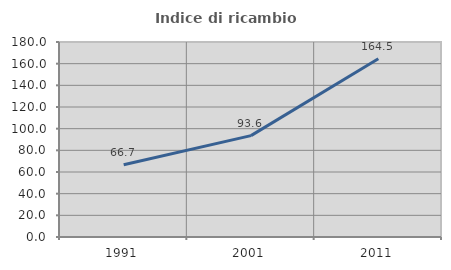
| Category | Indice di ricambio occupazionale  |
|---|---|
| 1991.0 | 66.667 |
| 2001.0 | 93.596 |
| 2011.0 | 164.467 |